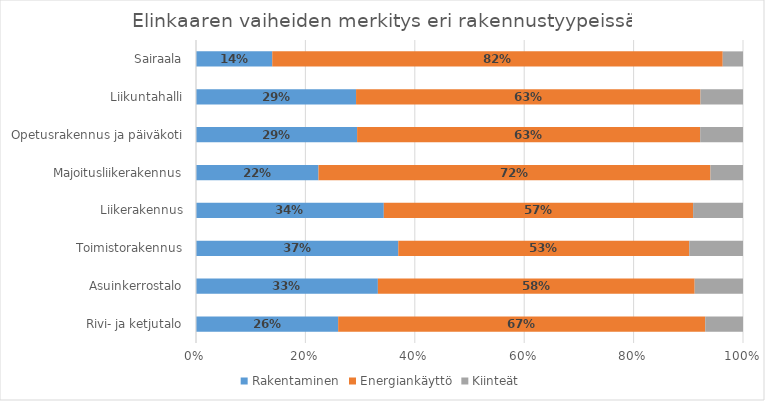
| Category | Rakentaminen | Energiankäyttö | Kiinteät |
|---|---|---|---|
| Rivi- ja ketjutalo | 0.26 | 0.671 | 0.069 |
| Asuinkerrostalo | 0.332 | 0.579 | 0.088 |
| Toimistorakennus | 0.37 | 0.532 | 0.098 |
| Liikerakennus | 0.343 | 0.565 | 0.091 |
| Majoitusliikerakennus | 0.224 | 0.717 | 0.059 |
| Opetusrakennus ja päiväkoti | 0.295 | 0.627 | 0.078 |
| Liikuntahalli | 0.293 | 0.63 | 0.078 |
| Sairaala | 0.139 | 0.824 | 0.037 |